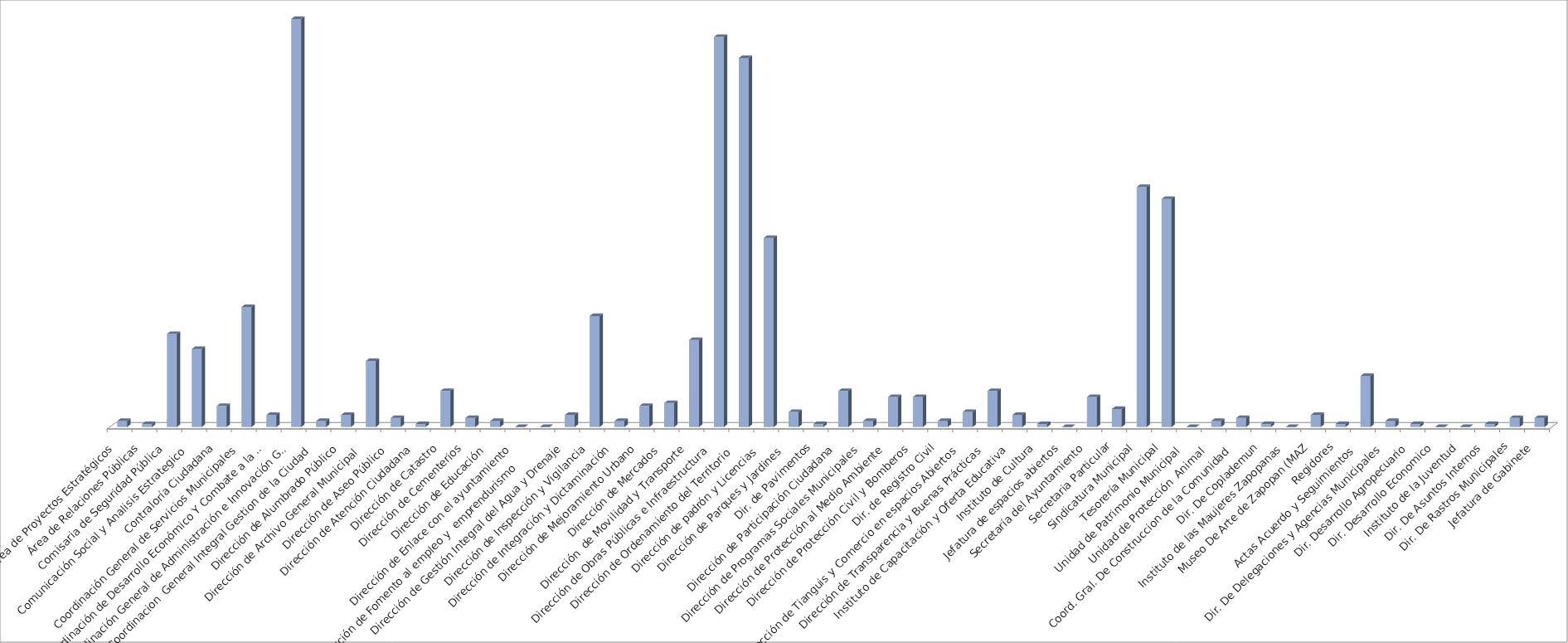
| Category | Series 0 | Series 1 |
|---|---|---|
| Area de Proyectos Estratégicos |  | 2 |
| Área de Relaciones Públicas |  | 1 |
| Comisaria de Seguridad Pública |  | 31 |
| Comunicación Social y Analisis Estrategico  |  | 26 |
| Contraloría Ciudadana |  | 7 |
| Coordinación General de Servicios Municipales |  | 40 |
| Coordinación de Desarrollo Económico Y Combate a la Desigualdad |  | 4 |
| Coordinación General de Administración e Innovación Gubernamental |  | 136 |
| Coordinacion  General Integral Gestion de la Ciudad |  | 2 |
| Dirección de Alumbrado Público |  | 4 |
| Dirección de Archivo General Municipal  |  | 22 |
| Dirección de Aseo Público  |  | 3 |
| Dirección de Atención Ciudadana |  | 1 |
| Dirección de Catastro |  | 12 |
| Dirección de Cementerios |  | 3 |
| Dirección de Educación  |  | 2 |
| Dirección de Enlace con el ayuntamiento |  | 0 |
| Dirección de Fomento al empleo y  emprendurismo         |  | 0 |
| Dirección de Gestión Integral del Agua y Drenaje |  | 4 |
| Dirección de Inspección y Vigilancia |  | 37 |
| Dirección de Integración y Dictaminación |  | 2 |
| Dirección de Mejoramiento Urbano |  | 7 |
| Dirección de Mercados  |  | 8 |
| Dirección  de Movilidad y Transporte |  | 29 |
| Dirección de Obras Públicas e Infraestructura |  | 130 |
| Dirección de Ordenamiento del Territorio  |  | 123 |
| Dirección de padrón y Licencias  |  | 63 |
| Dirección de Parques y Jardines  |  | 5 |
| Dir. de Pavimentos |  | 1 |
| Dirección de Participación Ciudadana |  | 12 |
| Dirección de Programas Sociales Municipales |  | 2 |
| Dirección de Protección al Medio Ambiente  |  | 10 |
| Dirección de Protección Civil y Bomberos |  | 10 |
| Dir. de Registro Civil |  | 2 |
| Dirección de Tianguis y Comercio en espacios Abiertos |  | 5 |
| Dirección de Transparencia y Buenas Prácticas |  | 12 |
| Instituto de Capacitación y Oferta Educativa |  | 4 |
| Instituto de Cultura  |  | 1 |
| Jefatura de espacios abiertos |  | 0 |
| Secretaría del Ayuntamiento |  | 10 |
| Secretaria Particular |  | 6 |
| Sindicatura Municipal |  | 80 |
| Tesorería Municipal |  | 76 |
| Unidad de Patrimonio Municipal  |  | 0 |
| Unidad de Protección  Animal  |  | 2 |
| Coord. Gral. De Construccion de la Comunidad |  | 3 |
| Dir. De Coplademun |  | 1 |
| Instituto de las Maujeres Zapopanas |  | 0 |
| Museo De Arte de Zapopan (MAZ |  | 4 |
| Regidores |  | 1 |
| Actas Acuerdo y Seguimientos  |  | 17 |
| Dir. De Delegaciones y Agencias Municipales |  | 2 |
|  Dir. Desarrollo Agropecuario |  | 1 |
| Dir. Desarrollo Economico |  | 0 |
| Instituto de la Juventud |  | 0 |
| Dir. De Asuntos Internos |  | 1 |
| Dir. De Rastros Municipales |  | 3 |
| Jefatura de Gabinete |  | 3 |